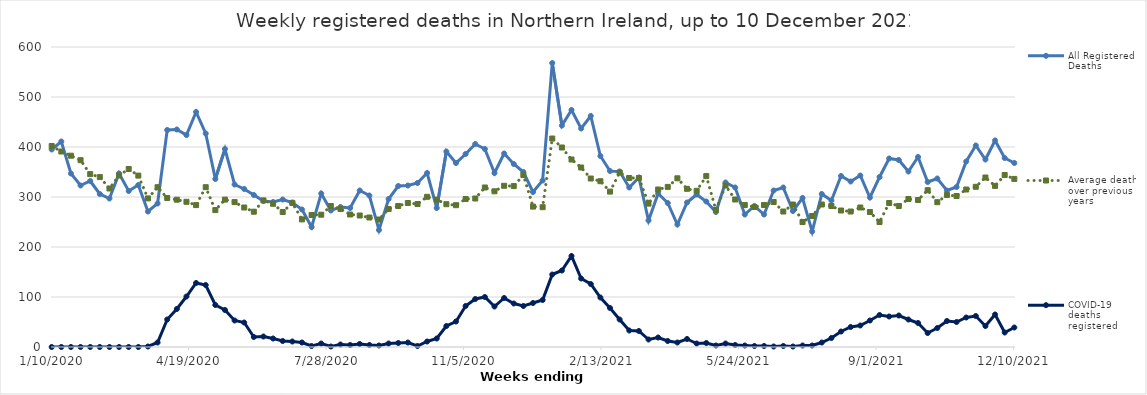
| Category | All Registered Deaths | Average deaths over previous 5 years | COVID-19 deaths registered |
|---|---|---|---|
| 1/10/20 | 395 | 402 | 0 |
| 1/17/20 | 411 | 391 | 0 |
| 1/24/20 | 347 | 382.6 | 0 |
| 1/31/20 | 323 | 373.6 | 0 |
| 2/7/20 | 332 | 345.8 | 0 |
| 2/14/20 | 306 | 339.8 | 0 |
| 2/21/20 | 297 | 317 | 0 |
| 2/28/20 | 347 | 343 | 0 |
| 3/6/20 | 312 | 356 | 0 |
| 3/13/20 | 324 | 342.8 | 0 |
| 3/20/20 | 271 | 297.2 | 1 |
| 3/27/20 | 287 | 319.6 | 9 |
| 4/3/20 | 434 | 298 | 55 |
| 4/10/20 | 435 | 294.6 | 76 |
| 4/17/20 | 424 | 290.4 | 101 |
| 4/24/20 | 470 | 283.8 | 128 |
| 5/1/20 | 427 | 319.6 | 124 |
| 5/8/20 | 336 | 273.8 | 84 |
| 5/15/20 | 396 | 294.8 | 74 |
| 5/22/20 | 325 | 289.8 | 53 |
| 5/29/20 | 316 | 279 | 49 |
| 6/5/20 | 304 | 270.6 | 20 |
| 6/12/20 | 292 | 293.2 | 21 |
| 6/19/20 | 290 | 286.4 | 17 |
| 6/26/20 | 295 | 270 | 12 |
| 7/3/20 | 289 | 288.2 | 11 |
| 7/10/20 | 275 | 255.2 | 9 |
| 7/17/20 | 240 | 264 | 2 |
| 7/24/20 | 307 | 264.6 | 7 |
| 7/31/20 | 273 | 282 | 1 |
| 8/7/20 | 280 | 276 | 5 |
| 8/14/20 | 278 | 265 | 4 |
| 8/21/20 | 313 | 263 | 6 |
| 8/28/20 | 303 | 259 | 4 |
| 9/4/20 | 234 | 255 | 3 |
| 9/11/20 | 296 | 276 | 7 |
| 9/18/20 | 322 | 282 | 8 |
| 9/25/20 | 323 | 288 | 9 |
| 10/2/20 | 328 | 286 | 2 |
| 10/9/20 | 348 | 300.4 | 11 |
| 10/16/20 | 278 | 294.8 | 17 |
| 10/23/20 | 391 | 285.6 | 42 |
| 10/30/20 | 368 | 283.6 | 51 |
| 11/6/20 | 386 | 296 | 82 |
| 11/13/20 | 406 | 297 | 96 |
| 11/20/20 | 396 | 319 | 100 |
| 11/27/20 | 348 | 311.4 | 81 |
| 12/4/20 | 387 | 322.4 | 98 |
| 12/11/20 | 366 | 321.8 | 87 |
| 12/18/20 | 350 | 343.8 | 82 |
| 12/25/20 | 310 | 280.8 | 88 |
| 1/1/21 | 333 | 279.6 | 94 |
| 1/8/21 | 568 | 417 | 145 |
| 1/15/21 | 443 | 399 | 153 |
| 1/22/21 | 474 | 375 | 182 |
| 1/29/21 | 437 | 359 | 137 |
| 2/5/21 | 462 | 337 | 126 |
| 2/12/21 | 382 | 331.6 | 99 |
| 2/19/21 | 352 | 310.8 | 78 |
| 2/26/21 | 351 | 349 | 55 |
| 3/5/21 | 319 | 338 | 33 |
| 3/12/21 | 339 | 338 | 32 |
| 3/19/21 | 253 | 286.8 | 15 |
| 3/26/21 | 307 | 315 | 19 |
| 4/2/21 | 288 | 320.2 | 12 |
| 4/9/21 | 245 | 337.4 | 9 |
| 4/16/21 | 289 | 316.4 | 16 |
| 4/23/21 | 305 | 312.4 | 7 |
| 4/30/21 | 291 | 341.8 | 8 |
| 5/7/21 | 270 | 274 | 3 |
| 5/14/21 | 329 | 323 | 7 |
| 5/21/21 | 319 | 295 | 4 |
| 5/28/21 | 265 | 284 | 3 |
| 6/4/21 | 282 | 280 | 2 |
| 6/11/21 | 265 | 284 | 2 |
| 6/18/21 | 313 | 290 | 1 |
| 6/25/21 | 319 | 271 | 2 |
| 7/2/21 | 272 | 285 | 1 |
| 7/9/21 | 298 | 250 | 3 |
| 7/16/21 | 231 | 262 | 3 |
| 7/23/21 | 306 | 285 | 9 |
| 7/30/21 | 293 | 282 | 18 |
| 8/6/21 | 342 | 273 | 31 |
| 8/13/21 | 331 | 271 | 40 |
| 8/20/21 | 343 | 279 | 43 |
| 8/27/21 | 299 | 270 | 53 |
| 9/3/21 | 340 | 250 | 64 |
| 9/10/21 | 377 | 288 | 61 |
| 9/17/21 | 374 | 282 | 63 |
| 9/24/21 | 351 | 296 | 55 |
| 10/1/21 | 380 | 294 | 48 |
| 10/8/21 | 330 | 313.6 | 28 |
| 10/15/21 | 337 | 289.6 | 38 |
| 10/22/21 | 313 | 304 | 52 |
| 10/29/21 | 320 | 302 | 50 |
| 11/5/21 | 371 | 315 | 59 |
| 11/12/21 | 403 | 320.4 | 62 |
| 11/19/21 | 375 | 339 | 42 |
| 11/26/21 | 413 | 322.2 | 65 |
| 12/3/21 | 378 | 344 | 29 |
| 12/10/21 | 368 | 336.2 | 39 |